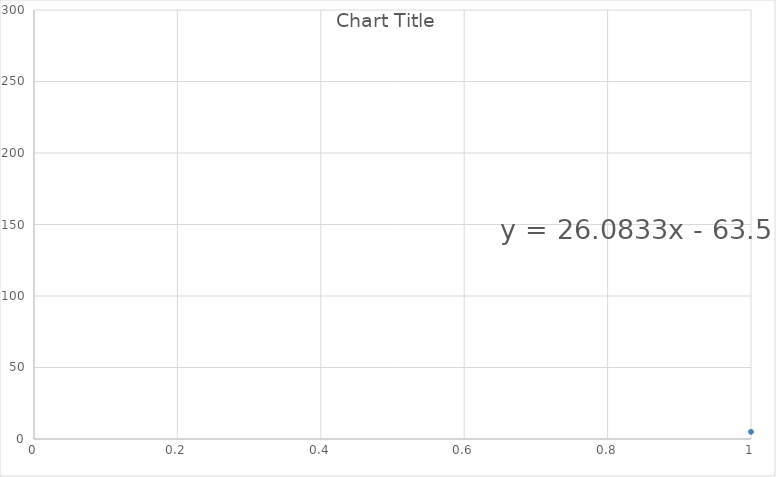
| Category | Series 0 |
|---|---|
| 0 | 5 |
| 1 | 5 |
| 2 | 17 |
| 3 | 17 |
| 4 | 28 |
| 5 | 32 |
| 6 | 47 |
| 7 | 280 |